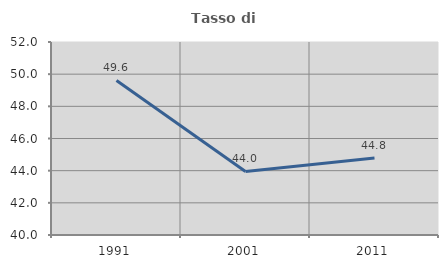
| Category | Tasso di occupazione   |
|---|---|
| 1991.0 | 49.606 |
| 2001.0 | 43.954 |
| 2011.0 | 44.794 |